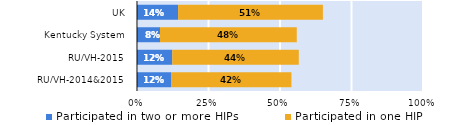
| Category | Participated in two or more HIPs | Participated in one HIP |
|---|---|---|
| RU/VH-2014&2015 | 0.119 | 0.421 |
| RU/VH-2015 | 0.123 | 0.442 |
| Kentucky System | 0.08 | 0.478 |
| UK | 0.144 | 0.506 |